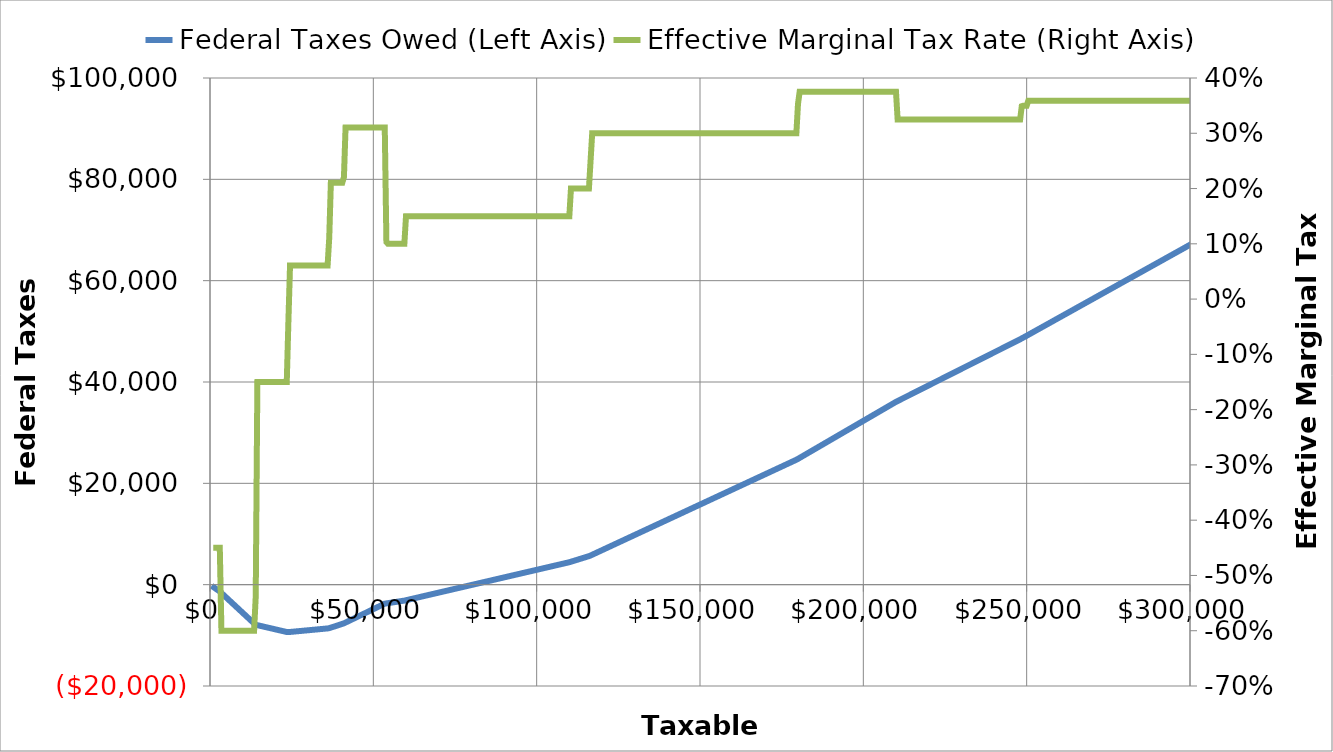
| Category | Federal Taxes Owed (Left Axis) |
|---|---|
| 500.0 | -225 |
| 1000.0 | -450 |
| 1500.0 | -675 |
| 2000.0 | -900 |
| 2500.0 | -1125 |
| 3000.0 | -1350 |
| 3500.0 | -1650 |
| 4000.0 | -1950 |
| 4500.0 | -2250 |
| 5000.0 | -2550 |
| 5500.0 | -2850 |
| 6000.0 | -3150 |
| 6500.0 | -3450 |
| 7000.0 | -3750 |
| 7500.0 | -4050 |
| 8000.0 | -4350 |
| 8500.0 | -4650 |
| 9000.0 | -4950 |
| 9500.0 | -5250 |
| 10000.0 | -5550 |
| 10500.0 | -5850 |
| 11000.0 | -6150 |
| 11500.0 | -6450 |
| 12000.0 | -6750 |
| 12500.0 | -7050 |
| 13000.0 | -7350 |
| 13500.0 | -7650 |
| 14000.0 | -7919 |
| 14500.0 | -7994 |
| 15000.0 | -8069 |
| 15500.0 | -8144 |
| 16000.0 | -8219 |
| 16500.0 | -8294 |
| 17000.0 | -8369 |
| 17500.0 | -8444 |
| 18000.0 | -8519 |
| 18500.0 | -8594 |
| 19000.0 | -8669 |
| 19500.0 | -8744 |
| 20000.0 | -8819 |
| 20500.0 | -8894 |
| 21000.0 | -8969 |
| 21500.0 | -9044 |
| 22000.0 | -9119 |
| 22500.0 | -9194 |
| 23000.0 | -9269 |
| 23500.0 | -9344 |
| 24000.0 | -9364.245 |
| 24500.0 | -9333.946 |
| 25000.0 | -9303.647 |
| 25500.0 | -9273.348 |
| 26000.0 | -9243.049 |
| 26500.0 | -9212.751 |
| 27000.0 | -9182.452 |
| 27500.0 | -9152.153 |
| 28000.0 | -9121.854 |
| 28500.0 | -9091.555 |
| 29000.0 | -9061.256 |
| 29500.0 | -9030.958 |
| 30000.0 | -9000.659 |
| 30500.0 | -8970.36 |
| 31000.0 | -8940.061 |
| 31500.0 | -8909.762 |
| 32000.0 | -8879.464 |
| 32500.0 | -8849.165 |
| 33000.0 | -8818.866 |
| 33500.0 | -8788.567 |
| 34000.0 | -8758.268 |
| 34500.0 | -8727.97 |
| 35000.0 | -8697.671 |
| 35500.0 | -8667.372 |
| 36000.0 | -8637.073 |
| 36500.0 | -8581.774 |
| 37000.0 | -8476.475 |
| 37500.0 | -8371.177 |
| 38000.0 | -8265.878 |
| 38500.0 | -8160.579 |
| 39000.0 | -8055.28 |
| 39500.0 | -7949.981 |
| 40000.0 | -7844.683 |
| 40500.0 | -7739.384 |
| 41000.0 | -7629.085 |
| 41500.0 | -7473.786 |
| 42000.0 | -7318.487 |
| 42500.0 | -7163.189 |
| 43000.0 | -7007.89 |
| 43500.0 | -6852.591 |
| 44000.0 | -6697.292 |
| 44500.0 | -6541.993 |
| 45000.0 | -6386.694 |
| 45500.0 | -6231.396 |
| 46000.0 | -6076.097 |
| 46500.0 | -5920.798 |
| 47000.0 | -5765.499 |
| 47500.0 | -5610.2 |
| 48000.0 | -5454.902 |
| 48500.0 | -5299.603 |
| 49000.0 | -5144.304 |
| 49500.0 | -4989.005 |
| 50000.0 | -4833.706 |
| 50500.0 | -4678.407 |
| 51000.0 | -4523.109 |
| 51500.0 | -4367.81 |
| 52000.0 | -4212.511 |
| 52500.0 | -4057.212 |
| 53000.0 | -3901.913 |
| 53500.0 | -3746.615 |
| 54000.0 | -3695 |
| 54500.0 | -3645 |
| 55000.0 | -3595 |
| 55500.0 | -3545 |
| 56000.0 | -3495 |
| 56500.0 | -3445 |
| 57000.0 | -3395 |
| 57500.0 | -3345 |
| 58000.0 | -3295 |
| 58500.0 | -3245 |
| 59000.0 | -3195 |
| 59500.0 | -3145 |
| 60000.0 | -3070 |
| 60500.0 | -2995 |
| 61000.0 | -2920 |
| 61500.0 | -2845 |
| 62000.0 | -2770 |
| 62500.0 | -2695 |
| 63000.0 | -2620 |
| 63500.0 | -2545 |
| 64000.0 | -2470 |
| 64500.0 | -2395 |
| 65000.0 | -2320 |
| 65500.0 | -2245 |
| 66000.0 | -2170 |
| 66500.0 | -2095 |
| 67000.0 | -2020 |
| 67500.0 | -1945 |
| 68000.0 | -1870 |
| 68500.0 | -1795 |
| 69000.0 | -1720 |
| 69500.0 | -1645 |
| 70000.0 | -1570 |
| 70500.0 | -1495 |
| 71000.0 | -1420 |
| 71500.0 | -1345 |
| 72000.0 | -1270 |
| 72500.0 | -1195 |
| 73000.0 | -1120 |
| 73500.0 | -1045 |
| 74000.0 | -970 |
| 74500.0 | -895 |
| 75000.0 | -820 |
| 75500.0 | -745 |
| 76000.0 | -670 |
| 76500.0 | -595 |
| 77000.0 | -520 |
| 77500.0 | -445 |
| 78000.0 | -370 |
| 78500.0 | -295 |
| 79000.0 | -220 |
| 79500.0 | -145 |
| 80000.0 | -70 |
| 80500.0 | 5 |
| 81000.0 | 80 |
| 81500.0 | 155 |
| 82000.0 | 230 |
| 82500.0 | 305 |
| 83000.0 | 380 |
| 83500.0 | 455 |
| 84000.0 | 530 |
| 84500.0 | 605 |
| 85000.0 | 680 |
| 85500.0 | 755 |
| 86000.0 | 830 |
| 86500.0 | 905 |
| 87000.0 | 980 |
| 87500.0 | 1055 |
| 88000.0 | 1130 |
| 88500.0 | 1205 |
| 89000.0 | 1280 |
| 89500.0 | 1355 |
| 90000.0 | 1430 |
| 90500.0 | 1505 |
| 91000.0 | 1580 |
| 91500.0 | 1655 |
| 92000.0 | 1730 |
| 92500.0 | 1805 |
| 93000.0 | 1880 |
| 93500.0 | 1955 |
| 94000.0 | 2030 |
| 94500.0 | 2105 |
| 95000.0 | 2180 |
| 95500.0 | 2255 |
| 96000.0 | 2330 |
| 96500.0 | 2405 |
| 97000.0 | 2480 |
| 97500.0 | 2555 |
| 98000.0 | 2630 |
| 98500.0 | 2705 |
| 99000.0 | 2780 |
| 99500.0 | 2855 |
| 100000.0 | 2930 |
| 100500.0 | 3005 |
| 101000.0 | 3080 |
| 101500.0 | 3155 |
| 102000.0 | 3230 |
| 102500.0 | 3305 |
| 103000.0 | 3380 |
| 103500.0 | 3455 |
| 104000.0 | 3530 |
| 104500.0 | 3605 |
| 105000.0 | 3680 |
| 105500.0 | 3755 |
| 106000.0 | 3830 |
| 106500.0 | 3905 |
| 107000.0 | 3980 |
| 107500.0 | 4055 |
| 108000.0 | 4130 |
| 108500.0 | 4205 |
| 109000.0 | 4280 |
| 109500.0 | 4355 |
| 110000.0 | 4430 |
| 110500.0 | 4530 |
| 111000.0 | 4630 |
| 111500.0 | 4730 |
| 112000.0 | 4830 |
| 112500.0 | 4930 |
| 113000.0 | 5030 |
| 113500.0 | 5130 |
| 114000.0 | 5230 |
| 114500.0 | 5330 |
| 115000.0 | 5430 |
| 115500.0 | 5530 |
| 116000.0 | 5630 |
| 116500.0 | 5755 |
| 117000.0 | 5905 |
| 117500.0 | 6055 |
| 118000.0 | 6205 |
| 118500.0 | 6355 |
| 119000.0 | 6505 |
| 119500.0 | 6655 |
| 120000.0 | 6805 |
| 120500.0 | 6955 |
| 121000.0 | 7105 |
| 121500.0 | 7255 |
| 122000.0 | 7405 |
| 122500.0 | 7555 |
| 123000.0 | 7705 |
| 123500.0 | 7855 |
| 124000.0 | 8005 |
| 124500.0 | 8155 |
| 125000.0 | 8305 |
| 125500.0 | 8455 |
| 126000.0 | 8605 |
| 126500.0 | 8755 |
| 127000.0 | 8905 |
| 127500.0 | 9055 |
| 128000.0 | 9205 |
| 128500.0 | 9355 |
| 129000.0 | 9505 |
| 129500.0 | 9655 |
| 130000.0 | 9805 |
| 130500.0 | 9955 |
| 131000.0 | 10105 |
| 131500.0 | 10255 |
| 132000.0 | 10405 |
| 132500.0 | 10555 |
| 133000.0 | 10705 |
| 133500.0 | 10855 |
| 134000.0 | 11005 |
| 134500.0 | 11155 |
| 135000.0 | 11305 |
| 135500.0 | 11455 |
| 136000.0 | 11605 |
| 136500.0 | 11755 |
| 137000.0 | 11905 |
| 137500.0 | 12055 |
| 138000.0 | 12205 |
| 138500.0 | 12355 |
| 139000.0 | 12505 |
| 139500.0 | 12655 |
| 140000.0 | 12805 |
| 140500.0 | 12955 |
| 141000.0 | 13105 |
| 141500.0 | 13255 |
| 142000.0 | 13405 |
| 142500.0 | 13555 |
| 143000.0 | 13705 |
| 143500.0 | 13855 |
| 144000.0 | 14005 |
| 144500.0 | 14155 |
| 145000.0 | 14305 |
| 145500.0 | 14455 |
| 146000.0 | 14605 |
| 146500.0 | 14755 |
| 147000.0 | 14905 |
| 147500.0 | 15055 |
| 148000.0 | 15205 |
| 148500.0 | 15355 |
| 149000.0 | 15505 |
| 149500.0 | 15655 |
| 150000.0 | 15805 |
| 150500.0 | 15955 |
| 151000.0 | 16105 |
| 151500.0 | 16255 |
| 152000.0 | 16405 |
| 152500.0 | 16555 |
| 153000.0 | 16705 |
| 153500.0 | 16855 |
| 154000.0 | 17005 |
| 154500.0 | 17155 |
| 155000.0 | 17305 |
| 155500.0 | 17455 |
| 156000.0 | 17605 |
| 156500.0 | 17755 |
| 157000.0 | 17905 |
| 157500.0 | 18055 |
| 158000.0 | 18205 |
| 158500.0 | 18355 |
| 159000.0 | 18505 |
| 159500.0 | 18655 |
| 160000.0 | 18805 |
| 160500.0 | 18955 |
| 161000.0 | 19105 |
| 161500.0 | 19255 |
| 162000.0 | 19405 |
| 162500.0 | 19555 |
| 163000.0 | 19705 |
| 163500.0 | 19855 |
| 164000.0 | 20005 |
| 164500.0 | 20155 |
| 165000.0 | 20305 |
| 165500.0 | 20455 |
| 166000.0 | 20605 |
| 166500.0 | 20755 |
| 167000.0 | 20905 |
| 167500.0 | 21055 |
| 168000.0 | 21205 |
| 168500.0 | 21355 |
| 169000.0 | 21505 |
| 169500.0 | 21655 |
| 170000.0 | 21805 |
| 170500.0 | 21955 |
| 171000.0 | 22105 |
| 171500.0 | 22255 |
| 172000.0 | 22405 |
| 172500.0 | 22555 |
| 173000.0 | 22705 |
| 173500.0 | 22855 |
| 174000.0 | 23005 |
| 174500.0 | 23155 |
| 175000.0 | 23305 |
| 175500.0 | 23455 |
| 176000.0 | 23605 |
| 176500.0 | 23755 |
| 177000.0 | 23905 |
| 177500.0 | 24055 |
| 178000.0 | 24205 |
| 178500.0 | 24355 |
| 179000.0 | 24505 |
| 179500.0 | 24655 |
| 180000.0 | 24831.5 |
| 180500.0 | 25019 |
| 181000.0 | 25206.5 |
| 181500.0 | 25394 |
| 182000.0 | 25581.5 |
| 182500.0 | 25769 |
| 183000.0 | 25956.5 |
| 183500.0 | 26144 |
| 184000.0 | 26331.5 |
| 184500.0 | 26519 |
| 185000.0 | 26706.5 |
| 185500.0 | 26894 |
| 186000.0 | 27081.5 |
| 186500.0 | 27269 |
| 187000.0 | 27456.5 |
| 187500.0 | 27644 |
| 188000.0 | 27831.5 |
| 188500.0 | 28019 |
| 189000.0 | 28206.5 |
| 189500.0 | 28394 |
| 190000.0 | 28581.5 |
| 190500.0 | 28769 |
| 191000.0 | 28956.5 |
| 191500.0 | 29144 |
| 192000.0 | 29331.5 |
| 192500.0 | 29519 |
| 193000.0 | 29706.5 |
| 193500.0 | 29894 |
| 194000.0 | 30081.5 |
| 194500.0 | 30269 |
| 195000.0 | 30456.5 |
| 195500.0 | 30644 |
| 196000.0 | 30831.5 |
| 196500.0 | 31019 |
| 197000.0 | 31206.5 |
| 197500.0 | 31394 |
| 198000.0 | 31581.5 |
| 198500.0 | 31769 |
| 199000.0 | 31956.5 |
| 199500.0 | 32144 |
| 200000.0 | 32331.5 |
| 200500.0 | 32519 |
| 201000.0 | 32706.5 |
| 201500.0 | 32894 |
| 202000.0 | 33081.5 |
| 202500.0 | 33269 |
| 203000.0 | 33456.5 |
| 203500.0 | 33644 |
| 204000.0 | 33831.5 |
| 204500.0 | 34019 |
| 205000.0 | 34206.5 |
| 205500.0 | 34394 |
| 206000.0 | 34581.5 |
| 206500.0 | 34769 |
| 207000.0 | 34956.5 |
| 207500.0 | 35144 |
| 208000.0 | 35331.5 |
| 208500.0 | 35519 |
| 209000.0 | 35706.5 |
| 209500.0 | 35894 |
| 210000.0 | 36081.5 |
| 210500.0 | 36244 |
| 211000.0 | 36406.5 |
| 211500.0 | 36569 |
| 212000.0 | 36731.5 |
| 212500.0 | 36894 |
| 213000.0 | 37056.5 |
| 213500.0 | 37219 |
| 214000.0 | 37381.5 |
| 214500.0 | 37544 |
| 215000.0 | 37706.5 |
| 215500.0 | 37869 |
| 216000.0 | 38031.5 |
| 216500.0 | 38194 |
| 217000.0 | 38356.5 |
| 217500.0 | 38519 |
| 218000.0 | 38681.5 |
| 218500.0 | 38844 |
| 219000.0 | 39006.5 |
| 219500.0 | 39169 |
| 220000.0 | 39331.5 |
| 220500.0 | 39494 |
| 221000.0 | 39656.5 |
| 221500.0 | 39819 |
| 222000.0 | 39981.5 |
| 222500.0 | 40144 |
| 223000.0 | 40306.5 |
| 223500.0 | 40469 |
| 224000.0 | 40631.5 |
| 224500.0 | 40794 |
| 225000.0 | 40956.5 |
| 225500.0 | 41119 |
| 226000.0 | 41281.5 |
| 226500.0 | 41444 |
| 227000.0 | 41606.5 |
| 227500.0 | 41769 |
| 228000.0 | 41931.5 |
| 228500.0 | 42094 |
| 229000.0 | 42256.5 |
| 229500.0 | 42419 |
| 230000.0 | 42581.5 |
| 230500.0 | 42744 |
| 231000.0 | 42906.5 |
| 231500.0 | 43069 |
| 232000.0 | 43231.5 |
| 232500.0 | 43394 |
| 233000.0 | 43556.5 |
| 233500.0 | 43719 |
| 234000.0 | 43881.5 |
| 234500.0 | 44044 |
| 235000.0 | 44206.5 |
| 235500.0 | 44369 |
| 236000.0 | 44531.5 |
| 236500.0 | 44694 |
| 237000.0 | 44856.5 |
| 237500.0 | 45019 |
| 238000.0 | 45181.5 |
| 238500.0 | 45344 |
| 239000.0 | 45506.5 |
| 239500.0 | 45669 |
| 240000.0 | 45831.5 |
| 240500.0 | 45994 |
| 241000.0 | 46156.5 |
| 241500.0 | 46319 |
| 242000.0 | 46481.5 |
| 242500.0 | 46644 |
| 243000.0 | 46806.5 |
| 243500.0 | 46969 |
| 244000.0 | 47131.5 |
| 244500.0 | 47294 |
| 245000.0 | 47456.5 |
| 245500.0 | 47619 |
| 246000.0 | 47781.5 |
| 246500.0 | 47944 |
| 247000.0 | 48106.5 |
| 247500.0 | 48269 |
| 248000.0 | 48431.5 |
| 248500.0 | 48606 |
| 249000.0 | 48781 |
| 249500.0 | 48956 |
| 250000.0 | 49131 |
| 250500.0 | 49310.5 |
| 251000.0 | 49490 |
| 251500.0 | 49669.5 |
| 252000.0 | 49849 |
| 252500.0 | 50028.5 |
| 253000.0 | 50208 |
| 253500.0 | 50387.5 |
| 254000.0 | 50567 |
| 254500.0 | 50746.5 |
| 255000.0 | 50926 |
| 255500.0 | 51105.5 |
| 256000.0 | 51285 |
| 256500.0 | 51464.5 |
| 257000.0 | 51644 |
| 257500.0 | 51823.5 |
| 258000.0 | 52003 |
| 258500.0 | 52182.5 |
| 259000.0 | 52362 |
| 259500.0 | 52541.5 |
| 260000.0 | 52721 |
| 260500.0 | 52900.5 |
| 261000.0 | 53080 |
| 261500.0 | 53259.5 |
| 262000.0 | 53439 |
| 262500.0 | 53618.5 |
| 263000.0 | 53798 |
| 263500.0 | 53977.5 |
| 264000.0 | 54157 |
| 264500.0 | 54336.5 |
| 265000.0 | 54516 |
| 265500.0 | 54695.5 |
| 266000.0 | 54875 |
| 266500.0 | 55054.5 |
| 267000.0 | 55234 |
| 267500.0 | 55413.5 |
| 268000.0 | 55593 |
| 268500.0 | 55772.5 |
| 269000.0 | 55952 |
| 269500.0 | 56131.5 |
| 270000.0 | 56311 |
| 270500.0 | 56490.5 |
| 271000.0 | 56670 |
| 271500.0 | 56849.5 |
| 272000.0 | 57029 |
| 272500.0 | 57208.5 |
| 273000.0 | 57388 |
| 273500.0 | 57567.5 |
| 274000.0 | 57747 |
| 274500.0 | 57926.5 |
| 275000.0 | 58106 |
| 275500.0 | 58285.5 |
| 276000.0 | 58465 |
| 276500.0 | 58644.5 |
| 277000.0 | 58824 |
| 277500.0 | 59003.5 |
| 278000.0 | 59183 |
| 278500.0 | 59362.5 |
| 279000.0 | 59542 |
| 279500.0 | 59721.5 |
| 280000.0 | 59901 |
| 280500.0 | 60080.5 |
| 281000.0 | 60260 |
| 281500.0 | 60439.5 |
| 282000.0 | 60619 |
| 282500.0 | 60798.5 |
| 283000.0 | 60978 |
| 283500.0 | 61157.5 |
| 284000.0 | 61337 |
| 284500.0 | 61516.5 |
| 285000.0 | 61696 |
| 285500.0 | 61875.5 |
| 286000.0 | 62055 |
| 286500.0 | 62234.5 |
| 287000.0 | 62414 |
| 287500.0 | 62593.5 |
| 288000.0 | 62773 |
| 288500.0 | 62952.5 |
| 289000.0 | 63132 |
| 289500.0 | 63311.5 |
| 290000.0 | 63491 |
| 290500.0 | 63670.5 |
| 291000.0 | 63850 |
| 291500.0 | 64029.5 |
| 292000.0 | 64209 |
| 292500.0 | 64388.5 |
| 293000.0 | 64568 |
| 293500.0 | 64747.5 |
| 294000.0 | 64927 |
| 294500.0 | 65106.5 |
| 295000.0 | 65286 |
| 295500.0 | 65465.5 |
| 296000.0 | 65645 |
| 296500.0 | 65824.5 |
| 297000.0 | 66004 |
| 297500.0 | 66183.5 |
| 298000.0 | 66363 |
| 298500.0 | 66542.5 |
| 299000.0 | 66722 |
| 299500.0 | 66901.5 |
| 300000.0 | 67081 |
| 300500.0 | 67260.5 |
| 301000.0 | 67440 |
| 301500.0 | 67619.5 |
| 302000.0 | 67799 |
| 302500.0 | 67978.5 |
| 303000.0 | 68158 |
| 303500.0 | 68337.5 |
| 304000.0 | 68517 |
| 304500.0 | 68696.5 |
| 305000.0 | 68876 |
| 305500.0 | 69055.5 |
| 306000.0 | 69235 |
| 306500.0 | 69414.5 |
| 307000.0 | 69594 |
| 307500.0 | 69773.5 |
| 308000.0 | 69953 |
| 308500.0 | 70132.5 |
| 309000.0 | 70312 |
| 309500.0 | 70491.5 |
| 310000.0 | 70671 |
| 310500.0 | 70850.5 |
| 311000.0 | 71030 |
| 311500.0 | 71209.5 |
| 312000.0 | 71389 |
| 312500.0 | 71568.5 |
| 313000.0 | 71748 |
| 313500.0 | 71927.5 |
| 314000.0 | 72107 |
| 314500.0 | 72286.5 |
| 315000.0 | 72466 |
| 315500.0 | 72645.5 |
| 316000.0 | 72825 |
| 316500.0 | 73004.5 |
| 317000.0 | 73184 |
| 317500.0 | 73363.5 |
| 318000.0 | 73543 |
| 318500.0 | 73722.5 |
| 319000.0 | 73902 |
| 319500.0 | 74081.5 |
| 320000.0 | 74261 |
| 320500.0 | 74440.5 |
| 321000.0 | 74620 |
| 321500.0 | 74799.5 |
| 322000.0 | 74979 |
| 322500.0 | 75158.5 |
| 323000.0 | 75338 |
| 323500.0 | 75517.5 |
| 324000.0 | 75697 |
| 324500.0 | 75876.5 |
| 325000.0 | 76056 |
| 325500.0 | 76235.5 |
| 326000.0 | 76415 |
| 326500.0 | 76594.5 |
| 327000.0 | 76774 |
| 327500.0 | 76953.5 |
| 328000.0 | 77133 |
| 328500.0 | 77312.5 |
| 329000.0 | 77492 |
| 329500.0 | 77671.5 |
| 330000.0 | 77851 |
| 330500.0 | 78030.5 |
| 331000.0 | 78210 |
| 331500.0 | 78389.5 |
| 332000.0 | 78569 |
| 332500.0 | 78748.5 |
| 333000.0 | 78928 |
| 333500.0 | 79107.5 |
| 334000.0 | 79287 |
| 334500.0 | 79466.5 |
| 335000.0 | 79646 |
| 335500.0 | 79825.5 |
| 336000.0 | 80005 |
| 336500.0 | 80184.5 |
| 337000.0 | 80364 |
| 337500.0 | 80543.5 |
| 338000.0 | 80723 |
| 338500.0 | 80902.5 |
| 339000.0 | 81082 |
| 339500.0 | 81261.5 |
| 340000.0 | 81441 |
| 340500.0 | 81620.5 |
| 341000.0 | 81800 |
| 341500.0 | 81979.5 |
| 342000.0 | 82159 |
| 342500.0 | 82338.5 |
| 343000.0 | 82518 |
| 343500.0 | 82697.5 |
| 344000.0 | 82877 |
| 344500.0 | 83056.5 |
| 345000.0 | 83236 |
| 345500.0 | 83415.5 |
| 346000.0 | 83595 |
| 346500.0 | 83774.5 |
| 347000.0 | 83954 |
| 347500.0 | 84133.5 |
| 348000.0 | 84313 |
| 348500.0 | 84492.5 |
| 349000.0 | 84672 |
| 349500.0 | 84851.5 |
| 350000.0 | 85031 |
| 350500.0 | 85210.5 |
| 351000.0 | 85390 |
| 351500.0 | 85569.5 |
| 352000.0 | 85749 |